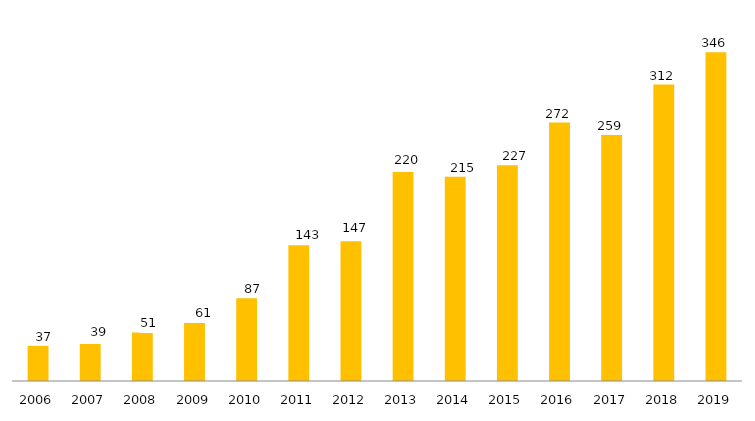
| Category | Programa |
|---|---|
| 2006.0 | 37 |
| 2007.0 | 39 |
| 2008.0 | 51 |
| 2009.0 | 61 |
| 2010.0 | 87 |
| 2011.0 | 143 |
| 2012.0 | 147 |
| 2013.0 | 220 |
| 2014.0 | 215 |
| 2015.0 | 227 |
| 2016.0 | 272 |
| 2017.0 | 259 |
| 2018.0 | 312 |
| 2019.0 | 346 |